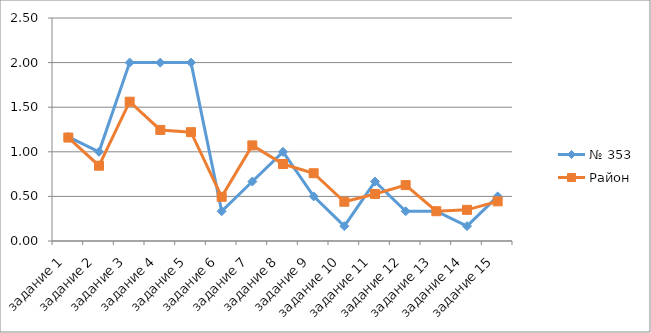
| Category | № 353 | Район |
|---|---|---|
| задание 1 | 1.167 | 1.16 |
| задание 2 | 1 | 0.844 |
| задание 3 | 2 | 1.562 |
| задание 4 | 2 | 1.245 |
| задание 5 | 2 | 1.22 |
| задание 6 | 0.333 | 0.496 |
| задание 7 | 0.667 | 1.072 |
| задание 8 | 1 | 0.863 |
| задание 9 | 0.5 | 0.76 |
| задание 10 | 0.167 | 0.44 |
| задание 11 | 0.667 | 0.527 |
| задание 12 | 0.333 | 0.627 |
| задание 13 | 0.333 | 0.334 |
| задание 14 | 0.167 | 0.349 |
| задание 15 | 0.5 | 0.445 |